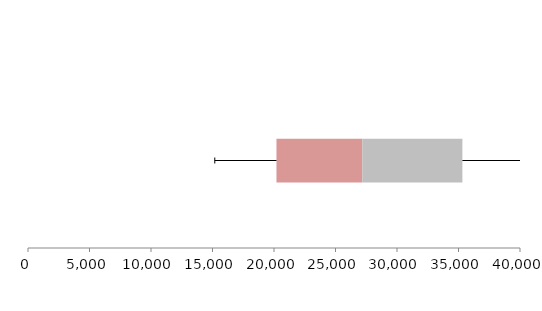
| Category | Series 1 | Series 2 | Series 3 |
|---|---|---|---|
| 0 | 20201.268 | 6977.974 | 8137.244 |